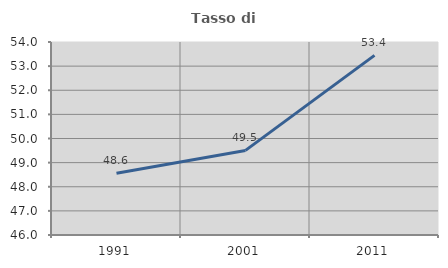
| Category | Tasso di occupazione   |
|---|---|
| 1991.0 | 48.56 |
| 2001.0 | 49.507 |
| 2011.0 | 53.447 |